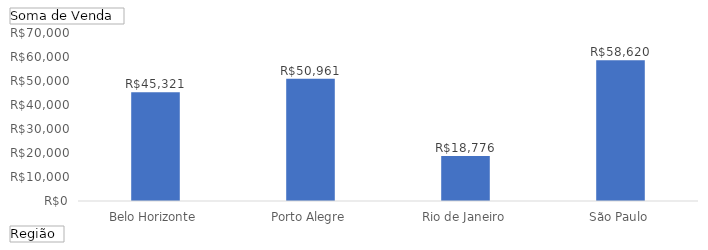
| Category | Total |
|---|---|
| Belo Horizonte | 45321 |
| Porto Alegre | 50961 |
| Rio de Janeiro | 18776 |
| São Paulo | 58620 |